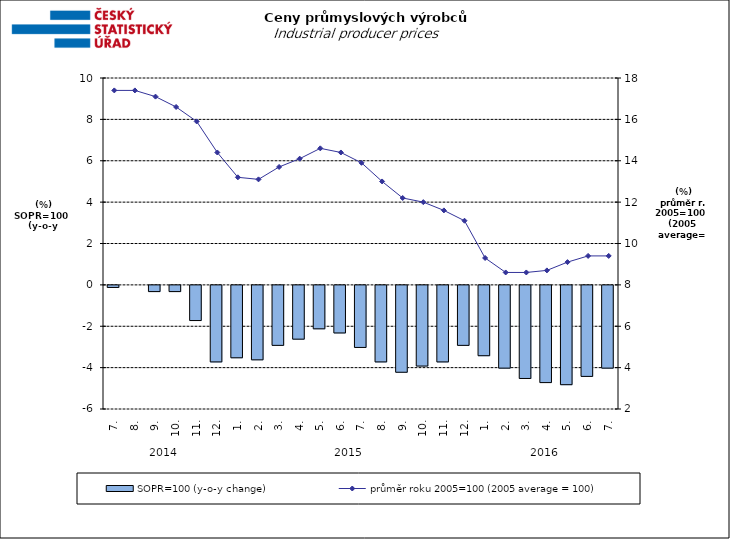
| Category | SOPR=100 (y-o-y change)   |
|---|---|
| 0 | -0.1 |
| 1 | 0 |
| 2 | -0.3 |
| 3 | -0.3 |
| 4 | -1.7 |
| 5 | -3.7 |
| 6 | -3.5 |
| 7 | -3.6 |
| 8 | -2.9 |
| 9 | -2.6 |
| 10 | -2.1 |
| 11 | -2.3 |
| 12 | -3 |
| 13 | -3.7 |
| 14 | -4.2 |
| 15 | -3.9 |
| 16 | -3.7 |
| 17 | -2.9 |
| 18 | -3.4 |
| 19 | -4 |
| 20 | -4.5 |
| 21 | -4.7 |
| 22 | -4.8 |
| 23 | -4.4 |
| 24 | -4 |